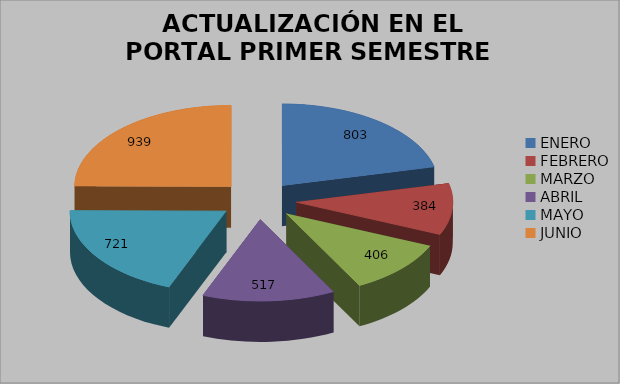
| Category |  ACTUALIZACIÓN EN EL PORTAL PRIMER SEMESTRE 2017 |
|---|---|
| ENERO | 803 |
| FEBRERO | 384 |
| MARZO | 406 |
| ABRIL | 517 |
| MAYO | 721 |
| JUNIO | 939 |